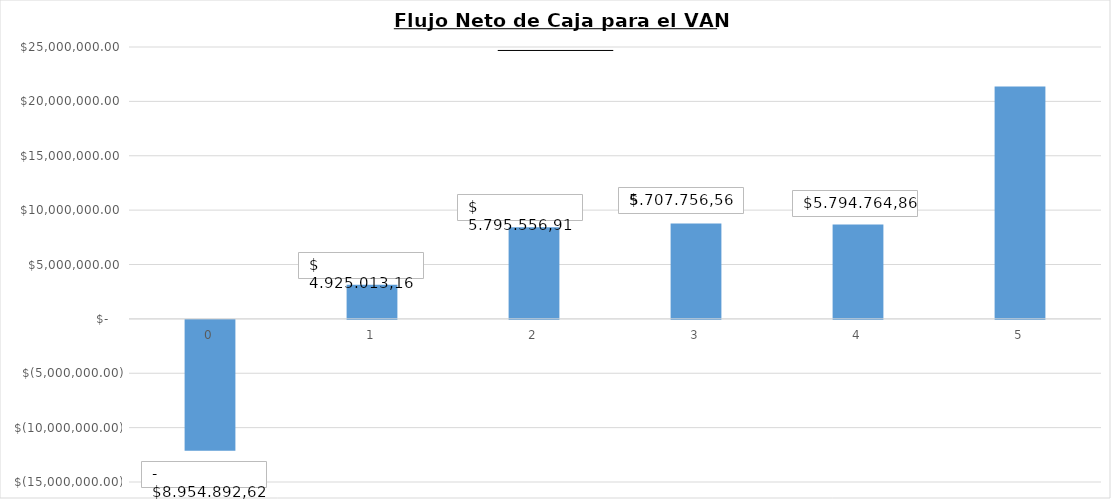
| Category | Series 0 |
|---|---|
| 0.0 | -12033076.642 |
| 1.0 | 3127218.306 |
| 2.0 | 8433525.385 |
| 3.0 | 8766484.002 |
| 4.0 | 8676330.633 |
| 5.0 | 21372869.721 |